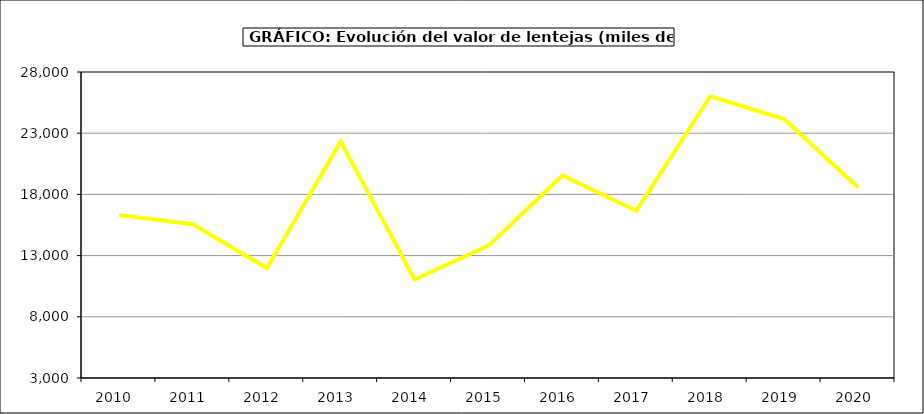
| Category | Valor |
|---|---|
| 2010.0 | 16307.099 |
| 2011.0 | 15562.569 |
| 2012.0 | 11960.065 |
| 2013.0 | 22313.5 |
| 2014.0 | 11051.282 |
| 2015.0 | 13811 |
| 2016.0 | 19549 |
| 2017.0 | 16662.624 |
| 2018.0 | 26017.402 |
| 2019.0 | 24153.639 |
| 2020.0 | 18559.488 |